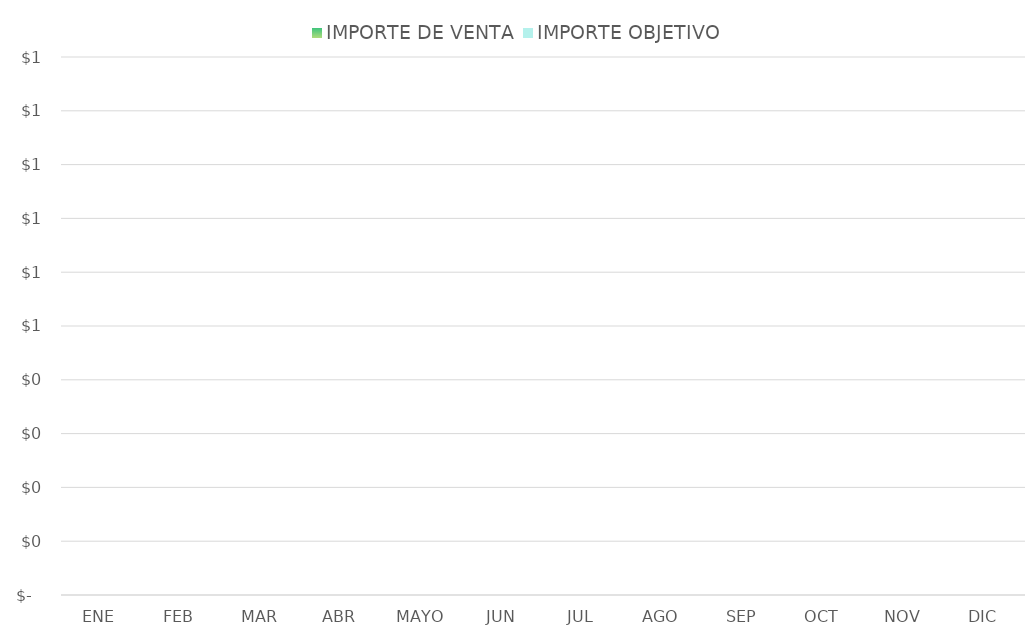
| Category | IMPORTE DE VENTA | IMPORTE OBJETIVO |
|---|---|---|
| ENE | 0 | 0 |
| FEB | 0 | 0 |
| MAR | 0 | 0 |
| ABR | 0 | 0 |
| MAYO | 0 | 0 |
| JUN | 0 | 0 |
| JUL | 0 | 0 |
| AGO | 0 | 0 |
| SEP | 0 | 0 |
| OCT | 0 | 0 |
| NOV | 0 | 0 |
| DIC | 0 | 0 |